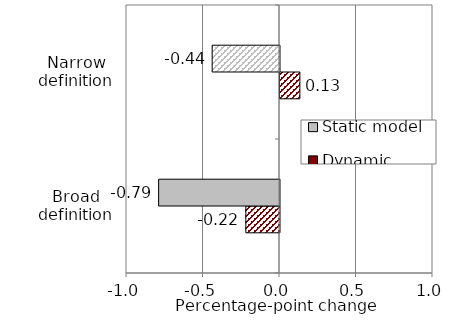
| Category | Dynamic model | Static model |
|---|---|---|
| Broad definition | -0.22 | -0.79 |
| Narrow definition | 0.13 | -0.44 |